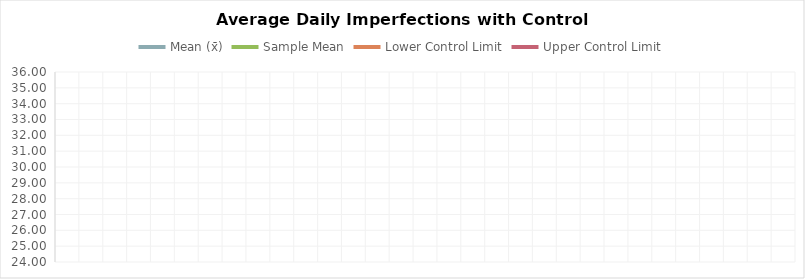
| Category | Mean (x̄) | Sample Mean | Lower Control Limit | Upper Control Limit |
|---|---|---|---|---|
| 0 | 0 | 0 | 0 | 0 |
| 1 | 0 | 0 | 0 | 0 |
| 2 | 0 | 0 | 0 | 0 |
| 3 | 0 | 0 | 0 | 0 |
| 4 | 0 | 0 | 0 | 0 |
| 5 | 0 | 0 | 0 | 0 |
| 6 | 0 | 0 | 0 | 0 |
| 7 | 0 | 0 | 0 | 0 |
| 8 | 0 | 0 | 0 | 0 |
| 9 | 0 | 0 | 0 | 0 |
| 10 | 0 | 0 | 0 | 0 |
| 11 | 0 | 0 | 0 | 0 |
| 12 | 0 | 0 | 0 | 0 |
| 13 | 0 | 0 | 0 | 0 |
| 14 | 0 | 0 | 0 | 0 |
| 15 | 0 | 0 | 0 | 0 |
| 16 | 0 | 0 | 0 | 0 |
| 17 | 0 | 0 | 0 | 0 |
| 18 | 0 | 0 | 0 | 0 |
| 19 | 0 | 0 | 0 | 0 |
| 20 | 0 | 0 | 0 | 0 |
| 21 | 0 | 0 | 0 | 0 |
| 22 | 0 | 0 | 0 | 0 |
| 23 | 0 | 0 | 0 | 0 |
| 24 | 0 | 0 | 0 | 0 |
| 25 | 0 | 0 | 0 | 0 |
| 26 | 0 | 0 | 0 | 0 |
| 27 | 0 | 0 | 0 | 0 |
| 28 | 0 | 0 | 0 | 0 |
| 29 | 0 | 0 | 0 | 0 |
| 30 | 0 | 0 | 0 | 0 |